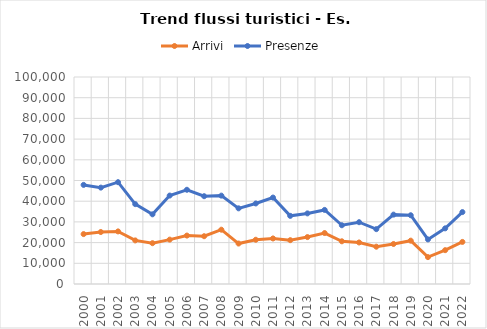
| Category | Arrivi | Presenze |
|---|---|---|
| 2000.0 | 24114 | 47877 |
| 2001.0 | 25106 | 46562 |
| 2002.0 | 25410 | 49189 |
| 2003.0 | 21056 | 38580 |
| 2004.0 | 19718 | 33663 |
| 2005.0 | 21437 | 42725 |
| 2006.0 | 23398 | 45520 |
| 2007.0 | 23090 | 42417 |
| 2008.0 | 26236 | 42691 |
| 2009.0 | 19543 | 36552 |
| 2010.0 | 21372 | 38910 |
| 2011.0 | 22002 | 41758 |
| 2012.0 | 21170 | 32918 |
| 2013.0 | 22667 | 34108 |
| 2014.0 | 24619 | 35790 |
| 2015.0 | 20631 | 28378 |
| 2016.0 | 20063 | 29854 |
| 2017.0 | 18019 | 26502 |
| 2018.0 | 19325 | 33510 |
| 2019.0 | 20936 | 33211 |
| 2020.0 | 12987 | 21540 |
| 2021.0 | 16346 | 26886 |
| 2022.0 | 20326 | 34742 |